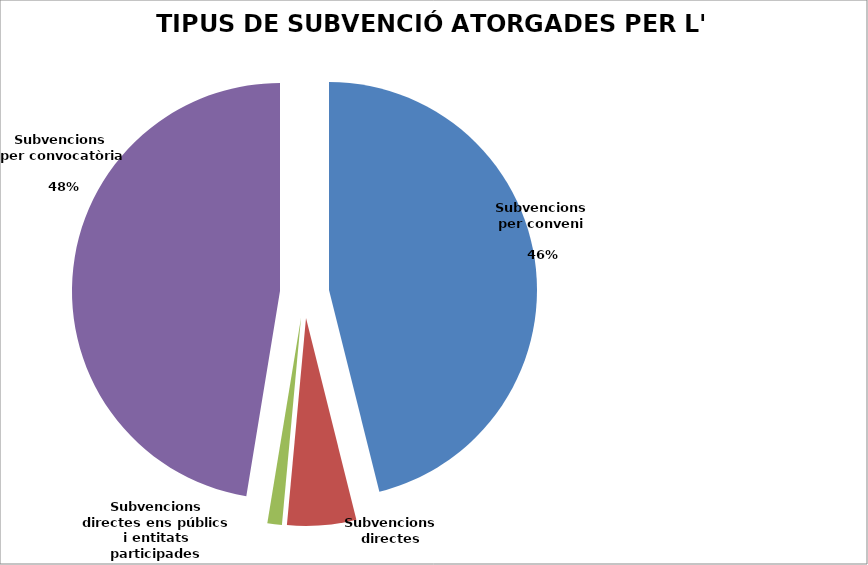
| Category | Series 0 |
|---|---|
| Subvencions
per conveni
pàg. 8 | 9845046 |
| Subvencions directes
pàg.14 | 1143917 |
| Subvencions
directes ens públics i entitats participades
pàg. 17 | 240830 |
| Subvencions 
per convocatòria
pàg.20 | 10123605 |